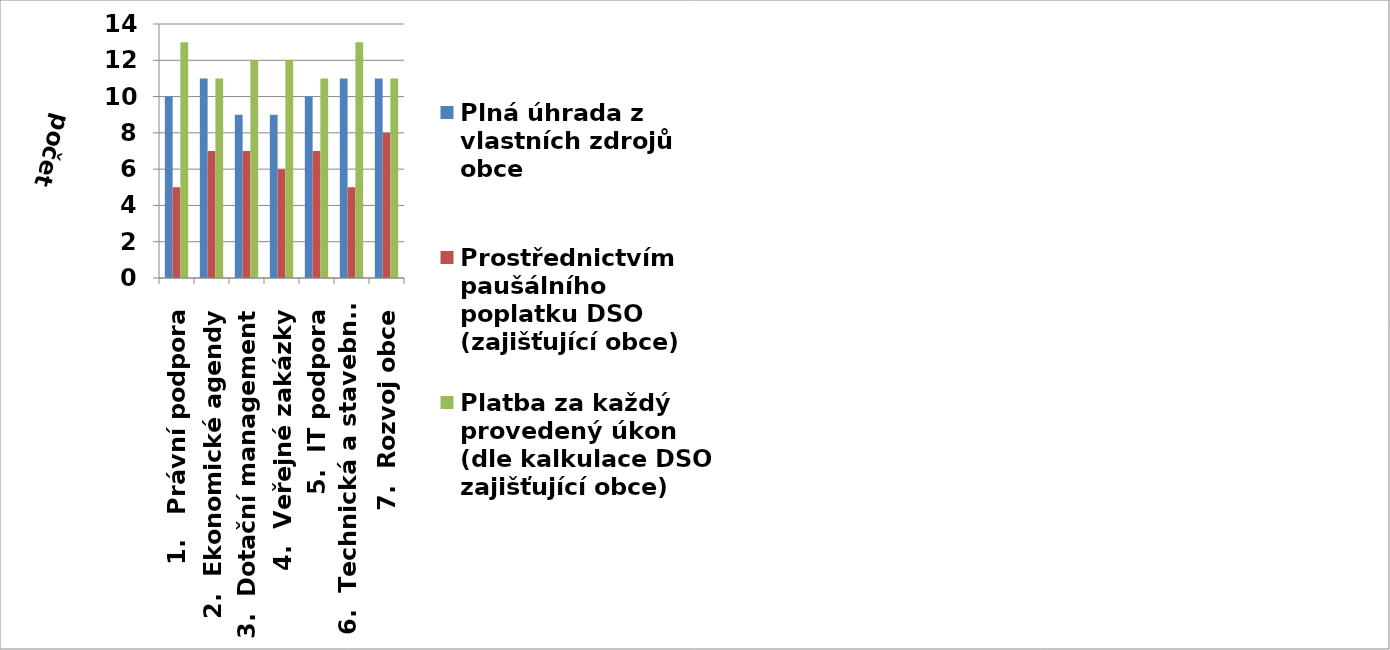
| Category | Plná úhrada z vlastních zdrojů obce | Prostřednictvím paušálního poplatku DSO (zajišťující obce) | Platba za každý provedený úkon (dle kalkulace DSO, zajišťující obce) |
|---|---|---|---|
| 1.   Právní podpora | 10 | 5 | 13 |
| 2.  Ekonomické agendy | 11 | 7 | 11 |
| 3.  Dotační management | 9 | 7 | 12 |
| 4.  Veřejné zakázky | 9 | 6 | 12 |
| 5.  IT podpora | 10 | 7 | 11 |
| 6.  Technická a stavební podpora | 11 | 5 | 13 |
| 7.  Rozvoj obce | 11 | 8 | 11 |